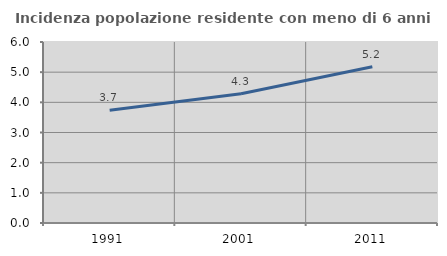
| Category | Incidenza popolazione residente con meno di 6 anni |
|---|---|
| 1991.0 | 3.737 |
| 2001.0 | 4.286 |
| 2011.0 | 5.181 |